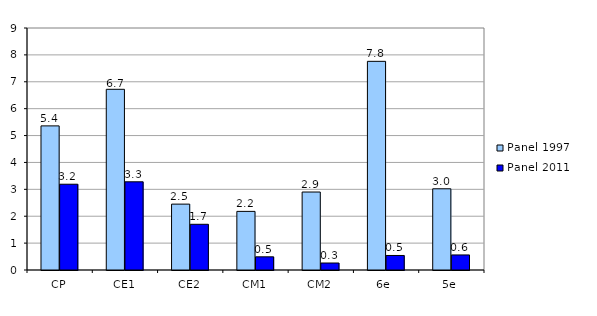
| Category | Panel 1997 | Panel 2011 |
|---|---|---|
| CP | 5.36 | 3.19 |
| CE1 | 6.72 | 3.28 |
| CE2 | 2.45 | 1.7 |
| CM1 | 2.18 | 0.49 |
| CM2 | 2.9 | 0.26 |
| 6e  | 7.76 | 0.54 |
| 5e | 3.02 | 0.56 |